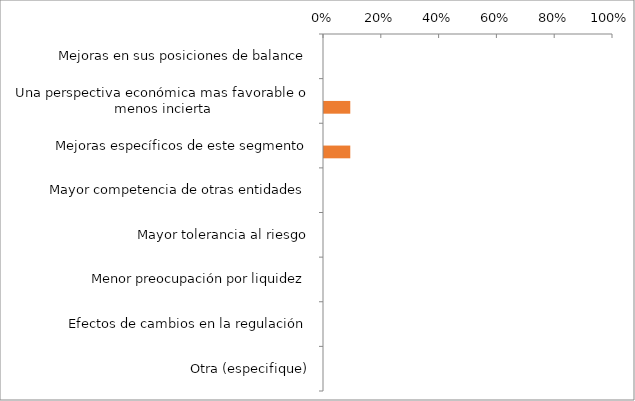
| Category | Series 0 | Series 1 |
|---|---|---|
| Mejoras en sus posiciones de balance |  | 0 |
| Una perspectiva económica mas favorable o menos incierta |  | 0.091 |
| Mejoras específicos de este segmento |  | 0.091 |
| Mayor competencia de otras entidades |  | 0 |
| Mayor tolerancia al riesgo |  | 0 |
| Menor preocupación por liquidez |  | 0 |
| Efectos de cambios en la regulación |  | 0 |
| Otra (especifique) |  | 0 |